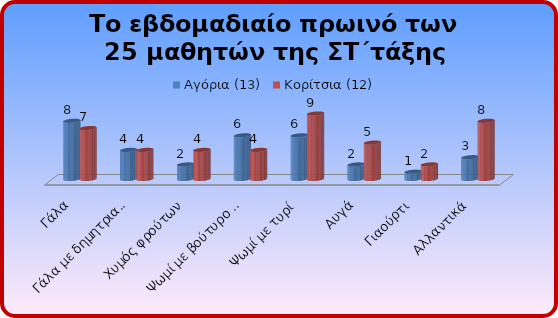
| Category | Αγόρια (13) | Κορίτσια (12) |
|---|---|---|
| Γάλα | 8 | 7 |
| Γάλα με δημητριακά | 4 | 4 |
| Χυμός φρούτων | 2 | 4 |
| Ψωμί με βούτυρο και μέλι | 6 | 4 |
| Ψωμί με τυρί | 6 | 9 |
| Αυγά | 2 | 5 |
| Γιαούρτι | 1 | 2 |
| Αλλαντικά | 3 | 8 |